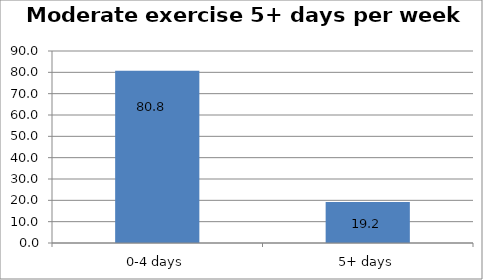
| Category | Series 0 |
|---|---|
| 0-4 days | 80.771 |
| 5+ days | 19.229 |